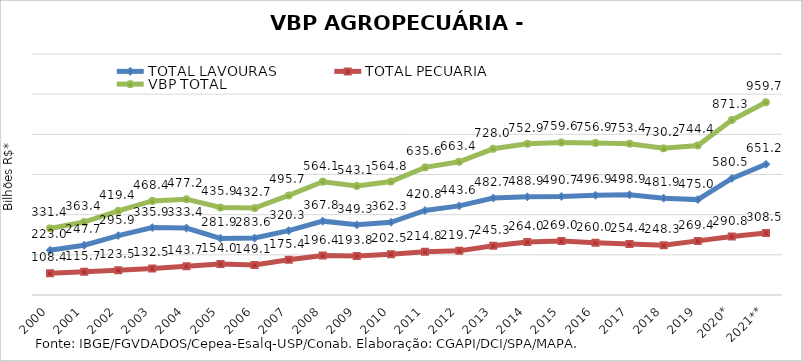
| Category | TOTAL LAVOURAS | TOTAL PECUÁRIA | VBP TOTAL |
|---|---|---|---|
| 2000 | 223.016 | 108.406 | 331.422 |
| 2001 | 247.73 | 115.655 | 363.385 |
| 2002 | 295.922 | 123.463 | 419.385 |
| 2003 | 335.869 | 132.516 | 468.385 |
| 2004 | 333.41 | 143.742 | 477.152 |
| 2005 | 281.883 | 153.983 | 435.866 |
| 2006 | 283.605 | 149.134 | 432.739 |
| 2007 | 320.28 | 175.448 | 495.728 |
| 2008 | 367.761 | 196.368 | 564.129 |
| 2009 | 349.324 | 193.814 | 543.138 |
| 2010 | 362.288 | 202.498 | 564.786 |
| 2011 | 420.752 | 214.798 | 635.551 |
| 2012 | 443.632 | 219.726 | 663.358 |
| 2013 | 482.675 | 245.297 | 727.972 |
| 2014 | 488.885 | 264.01 | 752.895 |
| 2015 | 490.659 | 268.954 | 759.613 |
| 2016 | 496.863 | 260.011 | 756.874 |
| 2017 | 498.926 | 254.424 | 753.351 |
| 2018 | 481.935 | 248.271 | 730.206 |
| 2019 | 475.004 | 269.446 | 744.45 |
| 2020* | 580.488 | 290.827 | 871.315 |
| 2021** | 651.157 | 308.501 | 959.658 |